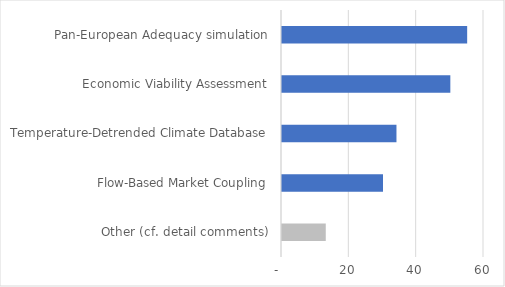
| Category | Priority score (highest = high priority) |
|---|---|
| Other (cf. detail comments) | 13 |
| Flow-Based Market Coupling | 30 |
| Temperature-Detrended Climate Database | 34 |
| Economic Viability Assessment | 50 |
| Pan-European Adequacy simulation | 55 |